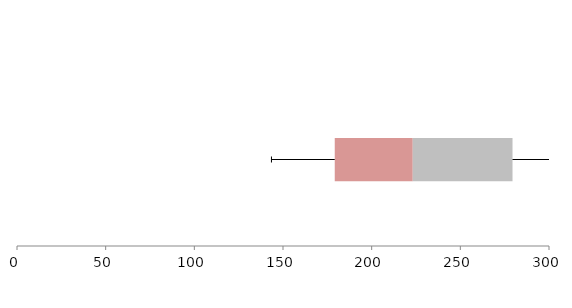
| Category | Series 1 | Series 2 | Series 3 |
|---|---|---|---|
| 0 | 179.181 | 43.987 | 56.257 |